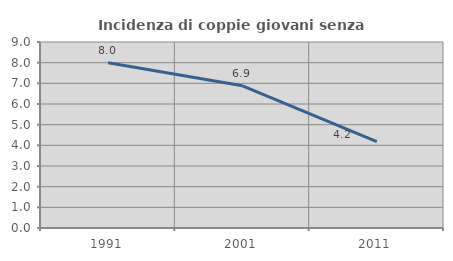
| Category | Incidenza di coppie giovani senza figli |
|---|---|
| 1991.0 | 8 |
| 2001.0 | 6.881 |
| 2011.0 | 4.183 |